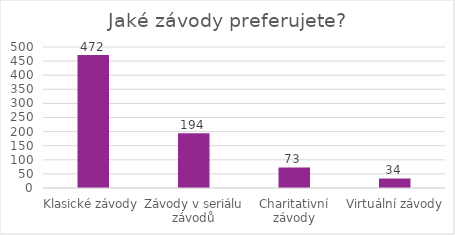
| Category | Series 0 |
|---|---|
| Klasické závody | 472 |
| Závody v seriálu závodů | 194 |
| Charitativní závody | 73 |
| Virtuální závody | 34 |